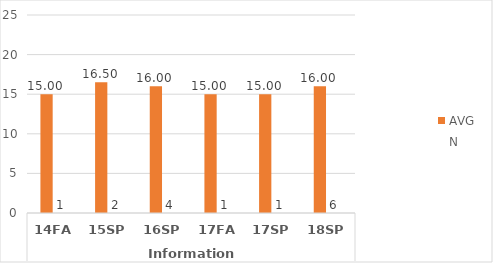
| Category | LA.AA - AVG | LA.AA - N |
|---|---|---|
| 0 | 15 | 1 |
| 1 | 16.5 | 2 |
| 2 | 16 | 4 |
| 3 | 15 | 1 |
| 4 | 15 | 1 |
| 5 | 16 | 6 |